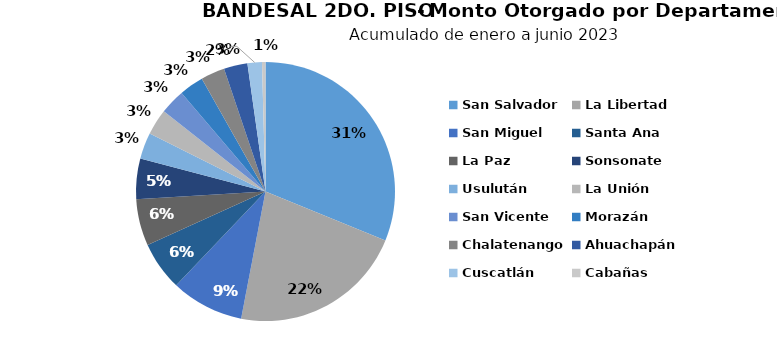
| Category | Monto |
|---|---|
| San Salvador | 35.192 |
| La Libertad | 24.665 |
| San Miguel | 10.264 |
| Santa Ana | 6.902 |
| La Paz | 6.573 |
| Sonsonate | 5.723 |
| Usulután | 3.702 |
| La Unión | 3.656 |
| San Vicente | 3.552 |
| Morazán | 3.435 |
| Chalatenango | 3.38 |
| Ahuachapán | 3.332 |
| Cuscatlán | 2.034 |
| Cabañas | 0.491 |